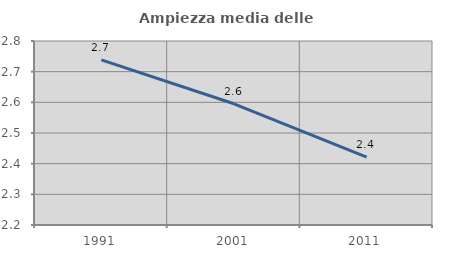
| Category | Ampiezza media delle famiglie |
|---|---|
| 1991.0 | 2.739 |
| 2001.0 | 2.595 |
| 2011.0 | 2.422 |